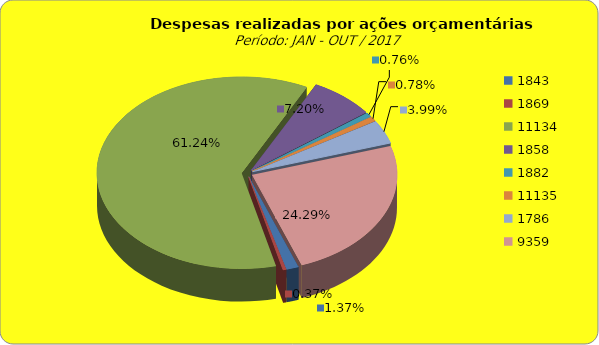
| Category | Series 1 |
|---|---|
| 1843.0 | 2929976.1 |
| 1869.0 | 783330.62 |
| 11134.0 | 131353518.83 |
| 1858.0 | 15453110.73 |
| 1882.0 | 1639231.26 |
| 11135.0 | 1666704.86 |
| 1786.0 | 8566460.56 |
| 9359.0 | 52087649.19 |